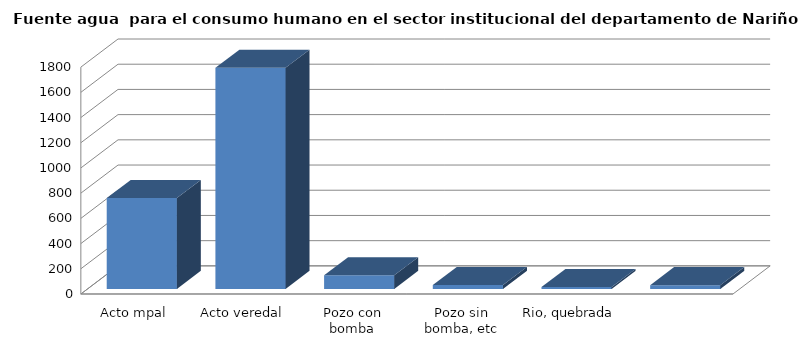
| Category | Series 0 |
|---|---|
| Acto mpal | 721.834 |
| Acto veredal | 1754.584 |
| Pozo con bomba | 108.282 |
| Pozo sin bomba, etc | 31.283 |
| Rio, quebrada | 15.34 |